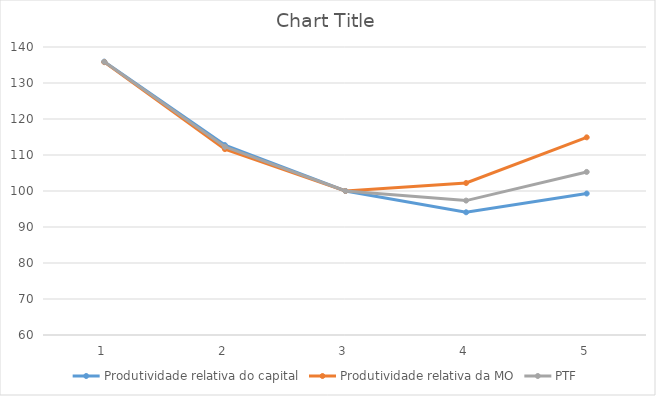
| Category | Produtividade relativa do capital | Produtividade relativa da MO | PTF |
|---|---|---|---|
| 0 | 135.932 | 135.789 | 135.872 |
| 1 | 112.752 | 111.637 | 112.282 |
| 2 | 100 | 100 | 100 |
| 3 | 94.089 | 102.222 | 97.337 |
| 4 | 99.3 | 114.905 | 105.299 |